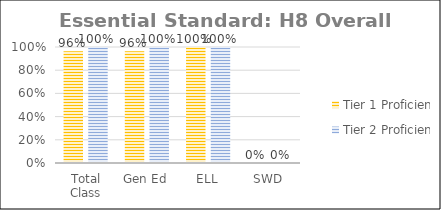
| Category | Tier 1 Proficiency | Tier 2 Proficiency |
|---|---|---|
| Total Class | 0.964 | 1 |
| Gen Ed | 0.964 | 1 |
| ELL | 1 | 1 |
| SWD | 0 | 0 |